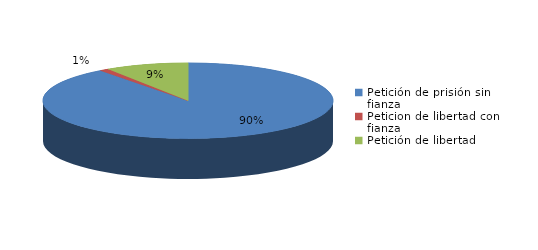
| Category | Series 0 |
|---|---|
| Petición de prisión sin fianza | 174 |
| Peticion de libertad con fianza | 2 |
| Petición de libertad | 18 |